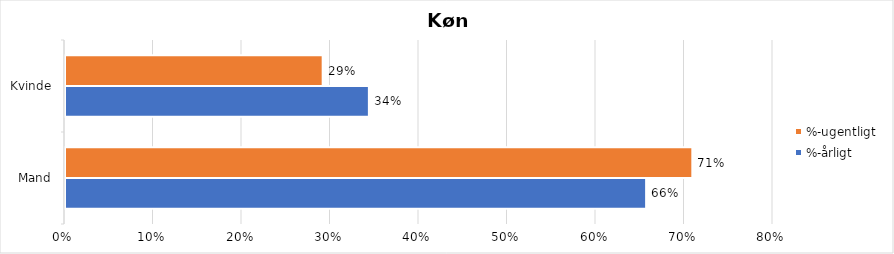
| Category | %-årligt | %-ugentligt |
|---|---|---|
| Mand | 0.657 | 0.709 |
| Kvinde | 0.343 | 0.291 |